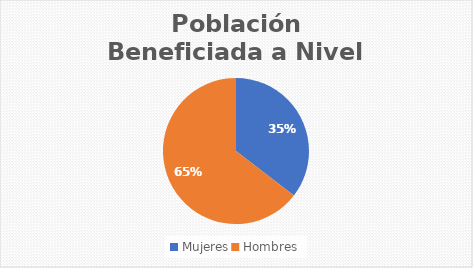
| Category | Series 0 |
|---|---|
| Mujeres | 34 |
| Hombres | 62 |